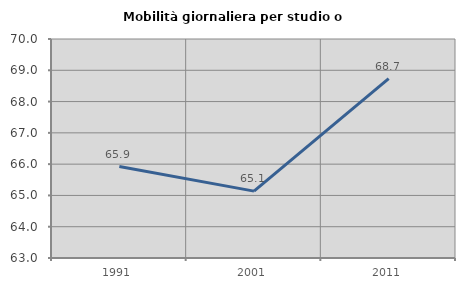
| Category | Mobilità giornaliera per studio o lavoro |
|---|---|
| 1991.0 | 65.922 |
| 2001.0 | 65.137 |
| 2011.0 | 68.734 |